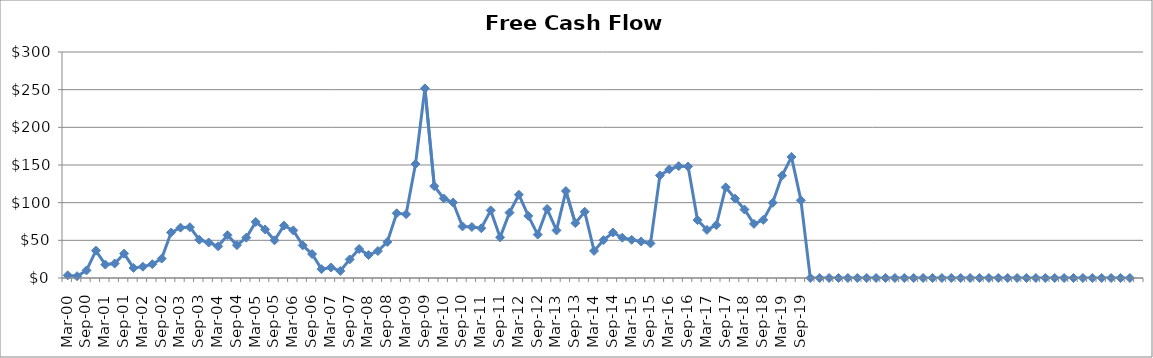
| Category | Series 0 |
|---|---|
| Mar-00 | 3.566 |
| Jun-00 | 2.4 |
| Sep-00 | 10.028 |
| Dec-00 | 36.312 |
| Mar-01 | 17.826 |
| Jun-01 | 19.234 |
| Sep-01 | 32.337 |
| Dec-01 | 13.36 |
| Mar-02 | 14.986 |
| Jun-02 | 18.362 |
| Sep-02 | 25.752 |
| Dec-02 | 60.402 |
| Mar-03 | 66.832 |
| Jun-03 | 67.481 |
| Sep-03 | 50.803 |
| Dec-03 | 47.117 |
| Mar-04 | 42.056 |
| Jun-04 | 56.815 |
| Sep-04 | 43.637 |
| Dec-04 | 53.537 |
| Mar-05 | 74.41 |
| Jun-05 | 64.481 |
| Sep-05 | 50.046 |
| Dec-05 | 69.574 |
| Mar-06 | 63.145 |
| Jun-06 | 43.318 |
| Sep-06 | 31.761 |
| Dec-06 | 11.726 |
| Mar-07 | 13.98 |
| Jun-07 | 9.334 |
| Sep-07 | 24.657 |
| Dec-07 | 38.572 |
| Mar-08 | 30.458 |
| Jun-08 | 35.768 |
| Sep-08 | 47.789 |
| Dec-08 | 85.902 |
| Mar-09 | 84.71 |
| Jun-09 | 151.326 |
| Sep-09 | 251.683 |
| Dec-09 | 121.859 |
| Mar-10 | 105.6 |
| Jun-10 | 100.215 |
| Sep-10 | 68.43 |
| Dec-10 | 67.7 |
| Mar-11 | 66.043 |
| Jun-11 | 89.758 |
| Sep-11 | 53.976 |
| Dec-11 | 86.81 |
| Mar-12 | 110.547 |
| Jun-12 | 82.414 |
| Sep-12 | 57.659 |
| Dec-12 | 91.717 |
| Mar-13 | 63.171 |
| Jun-13 | 115.394 |
| Sep-13 | 72.898 |
| Dec-13 | 87.936 |
| Mar-14 | 36.016 |
| Jun-14 | 50.178 |
| Sep-14 | 60.398 |
| Dec-14 | 53.498 |
| Mar-15 | 50.706 |
| Jun-15 | 48.506 |
| Sep-15 | 45.956 |
| Dec-15 | 136.143 |
| Mar-16 | 144.203 |
| Jun-16 | 148.498 |
| Sep-16 | 148 |
| Dec-16 | 76.845 |
| Mar-17 | 63.859 |
| Jun-17 | 70.252 |
| Sep-17 | 120.377 |
| Dec-17 | 105.359 |
| Mar-18 | 90.894 |
| Jun-18 | 71.848 |
| Sep-18 | 77.148 |
| Dec-18 | 99.879 |
| Mar-19 | 135.915 |
| Jun-19 | 160.693 |
| Sep-19 | 103.143 |